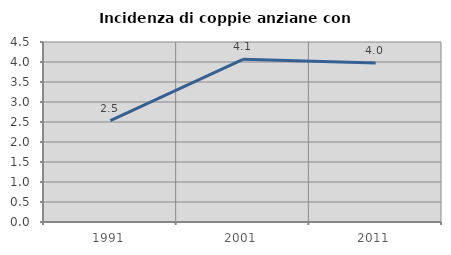
| Category | Incidenza di coppie anziane con figli |
|---|---|
| 1991.0 | 2.537 |
| 2001.0 | 4.067 |
| 2011.0 | 3.973 |